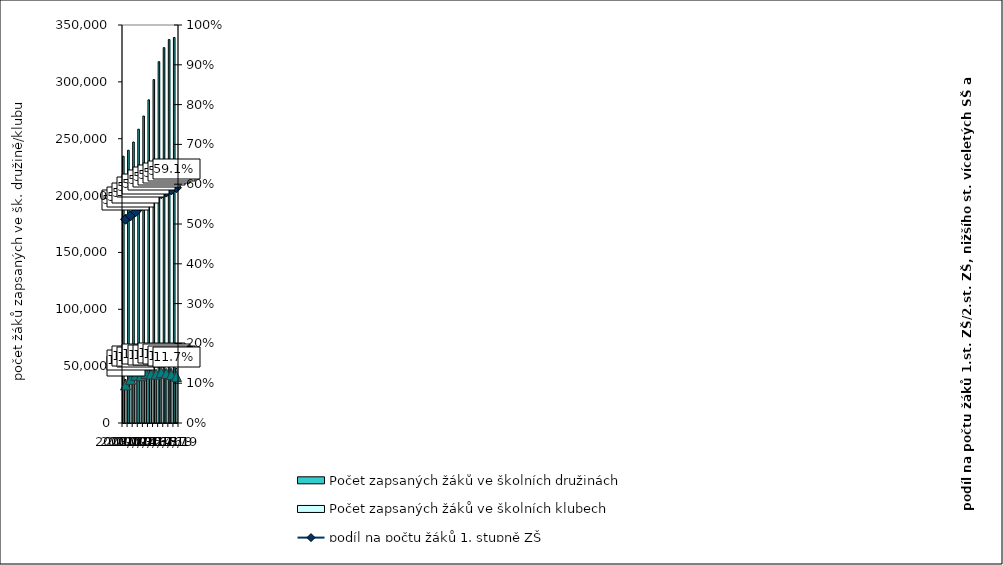
| Category | Počet zapsaných žáků ve školních družinách | Počet zapsaných žáků ve školních klubech |
|---|---|---|
| 2008/09 | 234566 | 38279 |
| 2009/10 | 239878 | 41225 |
| 2010/11 | 247093 | 43795 |
| 2011/12 | 258370 | 42939 |
| 2012/13 | 269935 | 44950 |
| 2013/14 | 284177 | 44547 |
| 2014/15 | 301990 | 44873 |
| 2015/16 | 317740 | 46980 |
| 2016/17 | 330094 | 47149 |
| 2017/18 | 337192 | 47675 |
| 2018/19 | 339037 | 47873 |